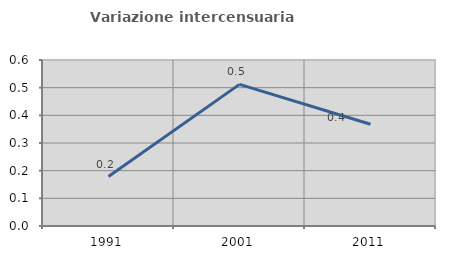
| Category | Variazione intercensuaria annua |
|---|---|
| 1991.0 | 0.179 |
| 2001.0 | 0.512 |
| 2011.0 | 0.368 |